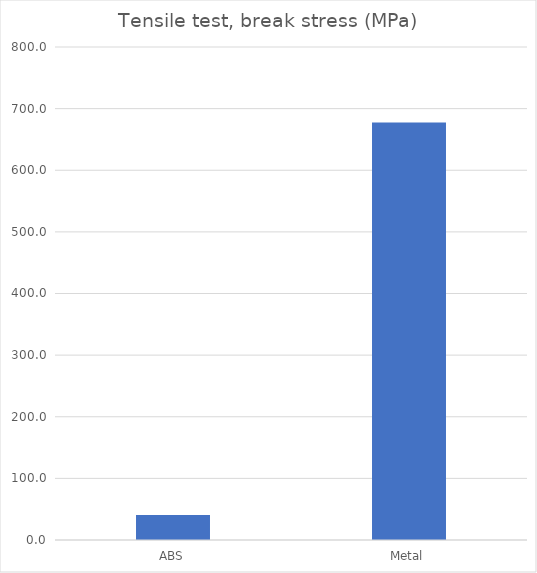
| Category | Stress [MPa] |
|---|---|
| ABS | 40.65 |
| Metal | 677.626 |